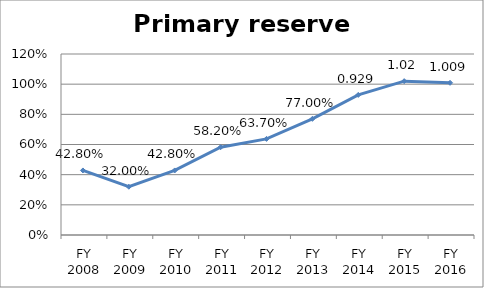
| Category | Primary reserve ratio |
|---|---|
| FY 2016 | 1.009 |
| FY 2015 | 1.02 |
| FY 2014 | 0.929 |
| FY 2013 | 0.77 |
| FY 2012 | 0.637 |
| FY 2011 | 0.582 |
| FY 2010 | 0.428 |
| FY 2009 | 0.32 |
| FY 2008 | 0.428 |